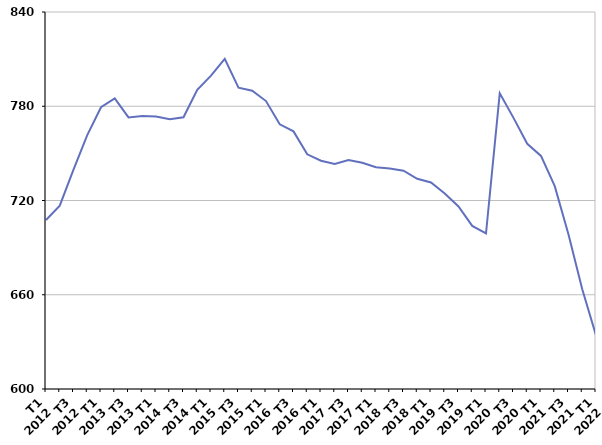
| Category | Moins de 25 ans |
|---|---|
| T1
2012 | 707.6 |
| T2
2012 | 716.7 |
| T3
2012 | 739.7 |
| T4
2012 | 761.6 |
| T1
2013 | 779.4 |
| T2
2013 | 785 |
| T3
2013 | 772.9 |
| T4
2013 | 773.8 |
| T1
2014 | 773.5 |
| T2
2014 | 771.7 |
| T3
2014 | 773 |
| T4
2014 | 790.5 |
| T1
2015 | 799.5 |
| T2
2015 | 810.2 |
| T3
2015 | 791.8 |
| T4
2015 | 789.9 |
| T1
2016 | 783.3 |
| T2
2016 | 768.5 |
| T3
2016 | 764 |
| T4
2016 | 749.4 |
| T1
2017 | 745.3 |
| T2
2017 | 743.2 |
| T3
2017 | 745.8 |
| T4
2017 | 744 |
| T1
2018 | 741.2 |
| T2
2018 | 740.4 |
| T3
2018 | 739 |
| T4
2018 | 733.8 |
| T1
2019 | 731.5 |
| T2
2019 | 724.5 |
| T3
2019 | 716.2 |
| T4
2019 | 703.8 |
| T1
2020 | 699 |
| T2
2020 | 788.3 |
| T3
2020 | 772.6 |
| T4
2020 | 756.1 |
| T1
2021 | 748.4 |
| T2
2021 | 729.1 |
| T3
2021 | 698.4 |
| T4
2021 | 663.5 |
| T1
2022 | 634.1 |